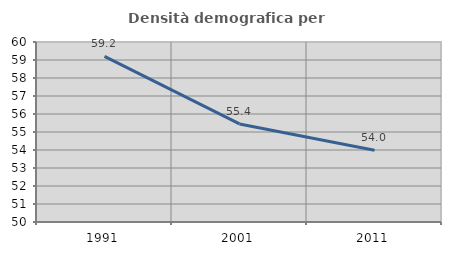
| Category | Densità demografica |
|---|---|
| 1991.0 | 59.197 |
| 2001.0 | 55.448 |
| 2011.0 | 53.986 |